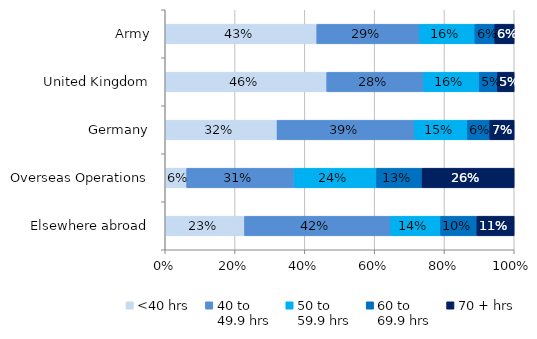
| Category | <40 hrs | 40 to 
49.9 hrs | 50 to 
59.9 hrs | 60 to 
69.9 hrs | 70 + hrs |
|---|---|---|---|---|---|
| Army | 0.434 | 0.294 | 0.159 | 0.057 | 0.056 |
| United Kingdom | 0.463 | 0.277 | 0.159 | 0.053 | 0.048 |
| Germany | 0.321 | 0.394 | 0.152 | 0.064 | 0.07 |
| Overseas Operations | 0.062 | 0.307 | 0.237 | 0.13 | 0.264 |
| Elsewhere abroad | 0.227 | 0.418 | 0.144 | 0.104 | 0.107 |